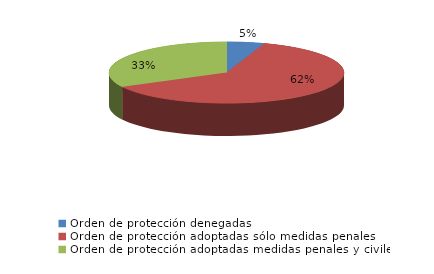
| Category | Series 0 |
|---|---|
| Orden de protección denegadas | 3 |
| Orden de protección adoptadas sólo medidas penales | 36 |
| Orden de protección adoptadas medidas penales y civiles | 19 |